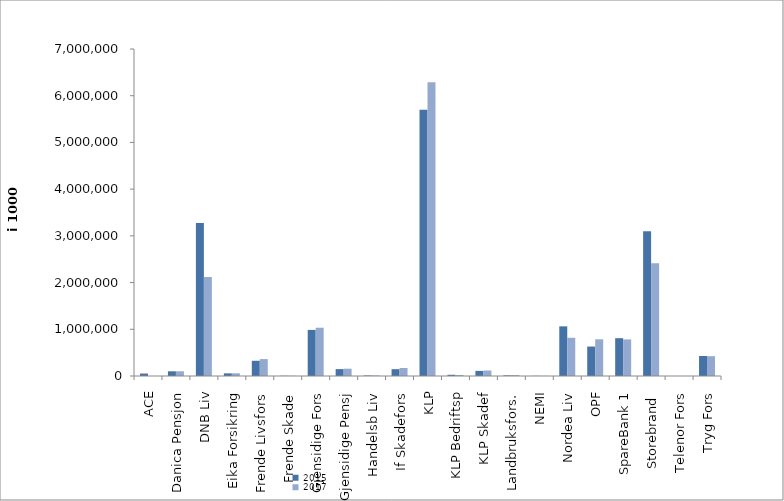
| Category | 2015 | 2017 |
|---|---|---|
| ACE | 52816.702 | 0 |
| Danica Pensjon | 100639.044 | 101335.864 |
| DNB Liv | 3273720 | 2121279 |
| Eika Forsikring | 56721 | 58168 |
| Frende Livsfors | 325972 | 362020 |
| Frende Skade | 4236 | 4414 |
| Gjensidige Fors | 986467 | 1033220 |
| Gjensidige Pensj | 147498.912 | 155987 |
| Handelsb Liv | 11212 | 11269 |
| If Skadefors | 145904 | 171195.791 |
| KLP | 5698583.12 | 6288898.735 |
| KLP Bedriftsp | 26138 | 21438 |
| KLP Skadef | 109496 | 117684.757 |
| Landbruksfors. | 13859 | 19934 |
| NEMI | 2609 | 2312 |
| Nordea Liv | 1062843.244 | 817756.212 |
| OPF | 630132 | 785297 |
| SpareBank 1 | 809372.635 | 782973.222 |
| Storebrand  | 3101227.945 | 2413053.41 |
| Telenor Fors | 0 | 0 |
| Tryg Fors | 427849.4 | 424578.353 |